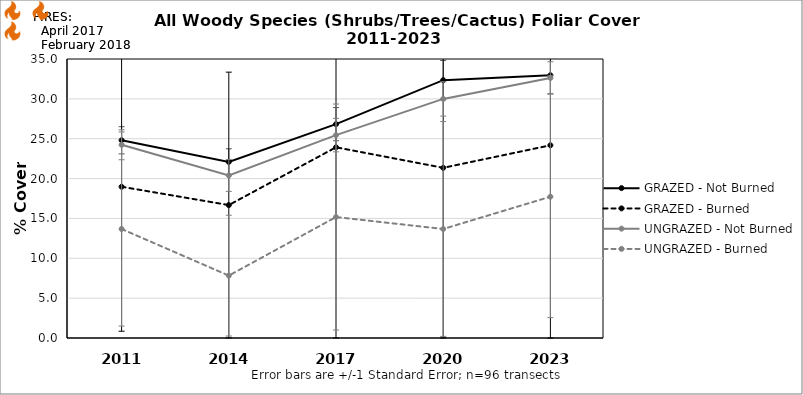
| Category | GRAZED - Not Burned | GRAZED - Burned | UNGRAZED - Not Burned | UNGRAZED - Burned |
|---|---|---|---|---|
| 2011.0 | 24.804 | 18.975 | 24.24 | 13.675 |
| 2014.0 | 22.092 | 16.675 | 20.396 | 7.825 |
| 2017.0 | 26.826 | 23.925 | 25.45 | 15.175 |
| 2020.0 | 32.345 | 21.35 | 29.993 | 13.675 |
| 2023.0 | 32.96 | 24.175 | 32.624 | 17.725 |